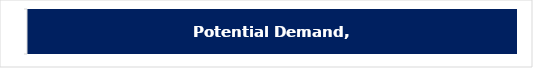
| Category | Potential Demand |
|---|---|
| 0 | 8942487.028 |